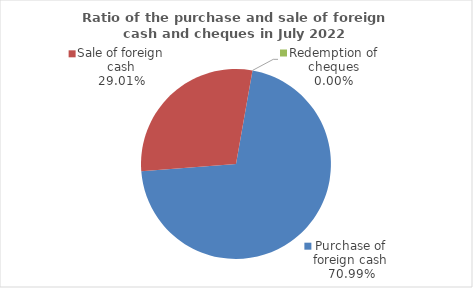
| Category | Series 0 |
|---|---|
| Purchase of foreign cash | 70.995 |
| Sale of foreign cash | 29.005 |
| Redemption of cheques | 0 |